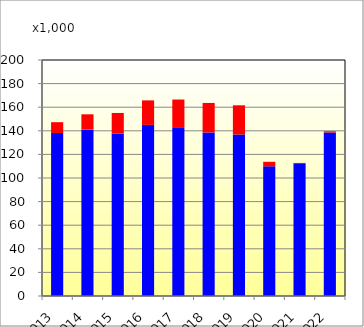
| Category | DOM | INT |
|---|---|---|
| 2013 | 138090 | 9212 |
| 2014 | 140976 | 12998 |
| 2015 | 137724 | 17396 |
| 2016 | 144988 | 20792 |
| 2017 | 143016 | 23482 |
| 2018 | 138606 | 25000 |
| 2019 | 136854 | 24758 |
| 2020 | 109902 | 3820 |
| 2021 | 112450 | 320 |
| 2022 | 138582 | 1032 |